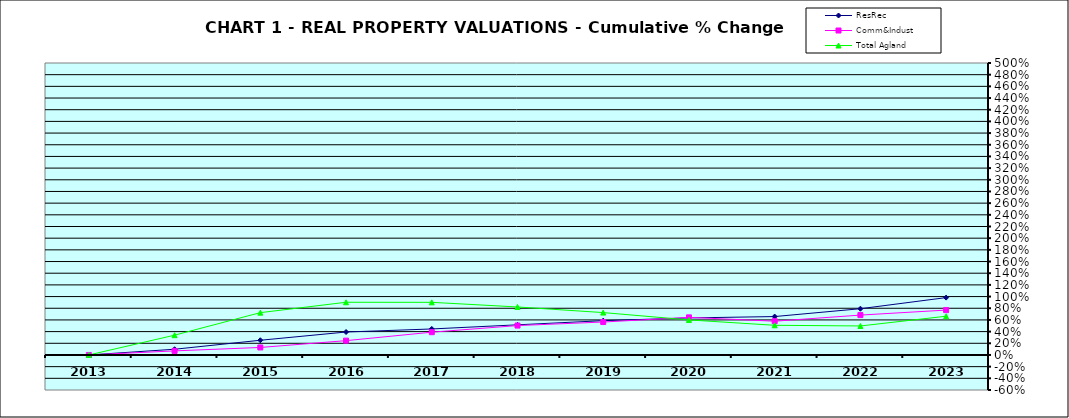
| Category | ResRec | Comm&Indust | Total Agland |
|---|---|---|---|
| 2013.0 | 0 | 0 | 0 |
| 2014.0 | 0.098 | 0.07 | 0.339 |
| 2015.0 | 0.252 | 0.129 | 0.725 |
| 2016.0 | 0.393 | 0.245 | 0.902 |
| 2017.0 | 0.445 | 0.39 | 0.901 |
| 2018.0 | 0.516 | 0.503 | 0.822 |
| 2019.0 | 0.587 | 0.564 | 0.726 |
| 2020.0 | 0.634 | 0.644 | 0.6 |
| 2021.0 | 0.658 | 0.578 | 0.508 |
| 2022.0 | 0.792 | 0.683 | 0.497 |
| 2023.0 | 0.982 | 0.769 | 0.663 |